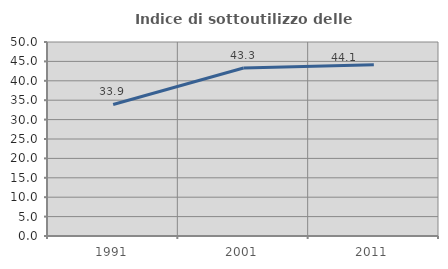
| Category | Indice di sottoutilizzo delle abitazioni  |
|---|---|
| 1991.0 | 33.908 |
| 2001.0 | 43.305 |
| 2011.0 | 44.149 |